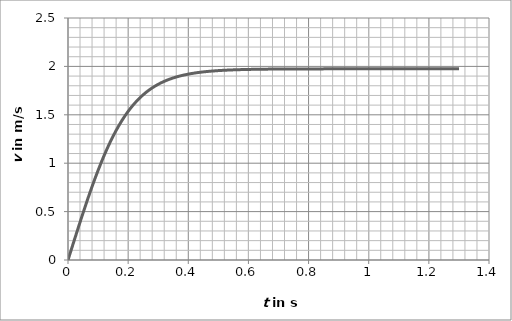
| Category | Series 0 |
|---|---|
| 0.0 | 0 |
| 0.02 | 0.196 |
| 0.04 | 0.39 |
| 0.06 | 0.579 |
| 0.08 | 0.758 |
| 0.1 | 0.926 |
| 0.12000000000000001 | 1.079 |
| 0.14 | 1.216 |
| 0.16 | 1.338 |
| 0.18 | 1.444 |
| 0.19999999999999998 | 1.535 |
| 0.21999999999999997 | 1.613 |
| 0.23999999999999996 | 1.678 |
| 0.25999999999999995 | 1.733 |
| 0.27999999999999997 | 1.778 |
| 0.3 | 1.815 |
| 0.32 | 1.846 |
| 0.34 | 1.87 |
| 0.36000000000000004 | 1.891 |
| 0.38000000000000006 | 1.907 |
| 0.4000000000000001 | 1.92 |
| 0.4200000000000001 | 1.931 |
| 0.4400000000000001 | 1.94 |
| 0.46000000000000013 | 1.946 |
| 0.48000000000000015 | 1.952 |
| 0.5000000000000001 | 1.957 |
| 0.5200000000000001 | 1.96 |
| 0.5400000000000001 | 1.963 |
| 0.5600000000000002 | 1.965 |
| 0.5800000000000002 | 1.967 |
| 0.6000000000000002 | 1.969 |
| 0.6200000000000002 | 1.97 |
| 0.6400000000000002 | 1.971 |
| 0.6600000000000003 | 1.972 |
| 0.6800000000000003 | 1.972 |
| 0.7000000000000003 | 1.973 |
| 0.7200000000000003 | 1.973 |
| 0.7400000000000003 | 1.974 |
| 0.7600000000000003 | 1.974 |
| 0.7800000000000004 | 1.974 |
| 0.8000000000000004 | 1.974 |
| 0.8200000000000004 | 1.974 |
| 0.8400000000000004 | 1.974 |
| 0.8600000000000004 | 1.974 |
| 0.8800000000000004 | 1.975 |
| 0.9000000000000005 | 1.975 |
| 0.9200000000000005 | 1.975 |
| 0.9400000000000005 | 1.975 |
| 0.9600000000000005 | 1.975 |
| 0.9800000000000005 | 1.975 |
| 1.0000000000000004 | 1.975 |
| 1.0200000000000005 | 1.975 |
| 1.0400000000000005 | 1.975 |
| 1.0600000000000005 | 1.975 |
| 1.0800000000000005 | 1.975 |
| 1.1000000000000005 | 1.975 |
| 1.1200000000000006 | 1.975 |
| 1.1400000000000006 | 1.975 |
| 1.1600000000000006 | 1.975 |
| 1.1800000000000006 | 1.975 |
| 1.2000000000000006 | 1.975 |
| 1.2200000000000006 | 1.975 |
| 1.2400000000000007 | 1.975 |
| 1.2600000000000007 | 1.975 |
| 1.2800000000000007 | 1.975 |
| 1.3000000000000007 | 1.975 |